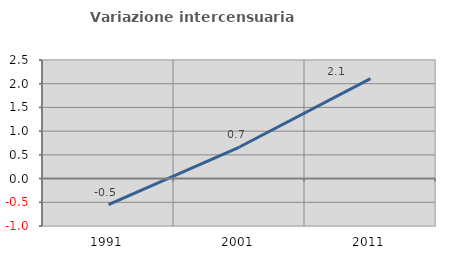
| Category | Variazione intercensuaria annua |
|---|---|
| 1991.0 | -0.549 |
| 2001.0 | 0.665 |
| 2011.0 | 2.106 |